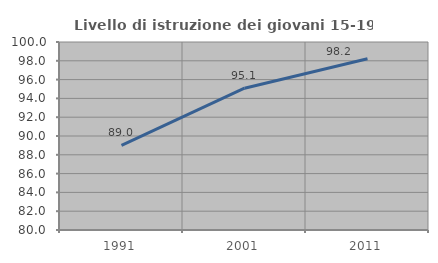
| Category | Livello di istruzione dei giovani 15-19 anni |
|---|---|
| 1991.0 | 89 |
| 2001.0 | 95.082 |
| 2011.0 | 98.214 |